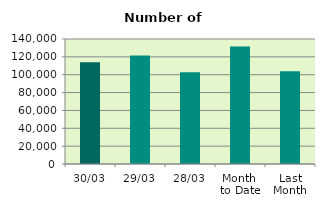
| Category | Series 0 |
|---|---|
| 30/03 | 114010 |
| 29/03 | 121582 |
| 28/03 | 102838 |
| Month 
to Date | 131733.091 |
| Last
Month | 103910.7 |